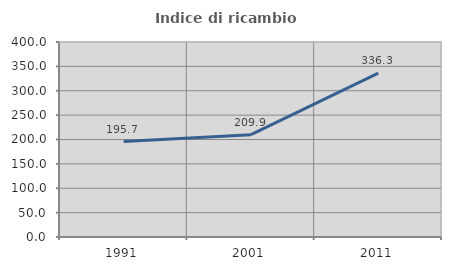
| Category | Indice di ricambio occupazionale  |
|---|---|
| 1991.0 | 195.745 |
| 2001.0 | 209.91 |
| 2011.0 | 336.264 |